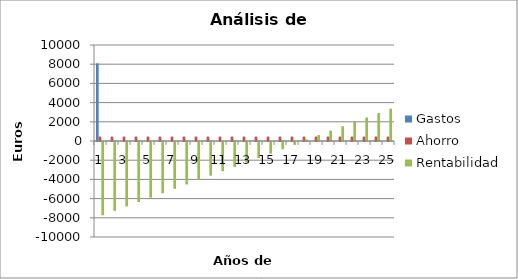
| Category | Gastos | Ahorro | Rentabilidad |
|---|---|---|---|
| 0 | 8087 | 458.2 | -7628.8 |
| 1 | 0 | 458.2 | -7170.6 |
| 2 | 0 | 458.2 | -6712.4 |
| 3 | 0 | 458.2 | -6254.2 |
| 4 | 0 | 458.2 | -5796 |
| 5 | 0 | 458.2 | -5337.8 |
| 6 | 0 | 458.2 | -4879.6 |
| 7 | 0 | 458.2 | -4421.4 |
| 8 | 0 | 458.2 | -3963.2 |
| 9 | 0 | 458.2 | -3505 |
| 10 | 0 | 458.2 | -3046.8 |
| 11 | 0 | 458.2 | -2588.6 |
| 12 | 0 | 458.2 | -2130.4 |
| 13 | 0 | 458.2 | -1672.2 |
| 14 | 0 | 458.2 | -1214 |
| 15 | 0 | 458.2 | -755.8 |
| 16 | 0 | 458.2 | -297.6 |
| 17 | 0 | 458.2 | 160.6 |
| 18 | 0 | 458.2 | 618.8 |
| 19 | 0 | 458.2 | 1077 |
| 20 | 0 | 458.2 | 1535.2 |
| 21 | 0 | 458.2 | 1993.4 |
| 22 | 0 | 458.2 | 2451.6 |
| 23 | 0 | 458.2 | 2909.8 |
| 24 | 0 | 458.2 | 3368 |